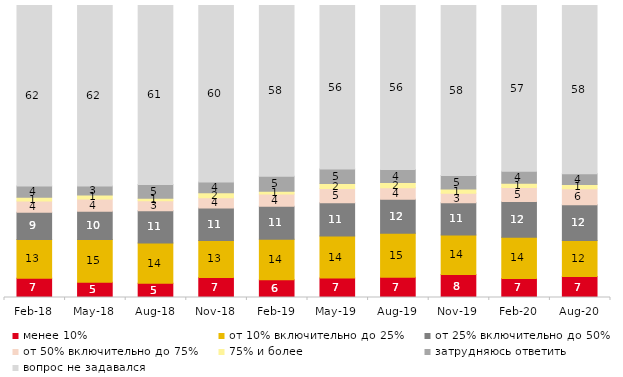
| Category | менее 10% | от 10% включительно до 25% | от 25% включительно до 50% | от 50% включительно до 75% | 75% и более | затрудняюсь ответить | вопрос не задавался |
|---|---|---|---|---|---|---|---|
| 2018-02-01 | 6.6 | 13.25 | 9.35 | 3.85 | 1.25 | 3.9 | 61.8 |
| 2018-05-01 | 5.25 | 14.6 | 9.7 | 4.2 | 1.35 | 3.1 | 61.8 |
| 2018-08-01 | 4.9 | 13.75 | 11.05 | 3.4 | 0.9 | 4.7 | 61.3 |
| 2018-11-01 | 6.886 | 12.625 | 11.128 | 3.543 | 1.697 | 3.643 | 60.479 |
| 2019-02-01 | 6.1 | 13.85 | 11.3 | 4.2 | 0.95 | 5.15 | 58.45 |
| 2019-05-01 | 6.686 | 14.364 | 11.392 | 4.854 | 1.734 | 5.002 | 55.968 |
| 2019-08-01 | 6.893 | 15.135 | 11.638 | 3.946 | 1.748 | 4.496 | 56.144 |
| 2019-11-01 | 7.871 | 13.515 | 11.04 | 3.267 | 1.485 | 4.604 | 58.218 |
| 2020-02-01 | 6.535 | 14.059 | 12.277 | 4.802 | 1.485 | 4.059 | 56.782 |
| 2020-08-01 | 7.15 | 12.413 | 12.165 | 5.511 | 1.49 | 3.674 | 57.597 |